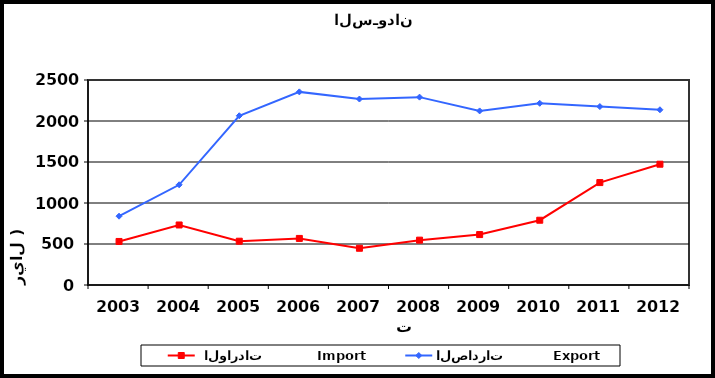
| Category |  الواردات           Import | الصادرات          Export |
|---|---|---|
| 2003.0 | 531 | 839 |
| 2004.0 | 732 | 1222 |
| 2005.0 | 534 | 2064 |
| 2006.0 | 568 | 2355 |
| 2007.0 | 448 | 2268 |
| 2008.0 | 547 | 2291 |
| 2009.0 | 615 | 2123 |
| 2010.0 | 790 | 2216 |
| 2011.0 | 1249 | 2176 |
| 2012.0 | 1473 | 2137 |